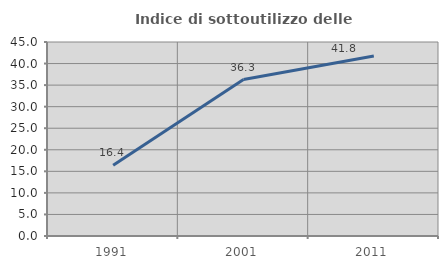
| Category | Indice di sottoutilizzo delle abitazioni  |
|---|---|
| 1991.0 | 16.407 |
| 2001.0 | 36.295 |
| 2011.0 | 41.769 |